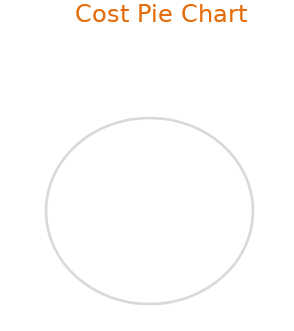
| Category | Total costs by area |
|---|---|
| 0 | 0 |
| 1 | 0 |
| 2 | 0 |
| 3 | 0 |
| 4 | 0 |
| 5 | 0 |
| 6 | 0 |
| 7 | 0 |
| 8 | 0 |